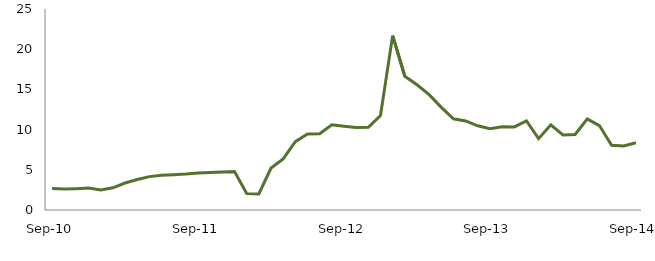
| Category | Series 0 |
|---|---|
| Sep-10 | 2.664 |
|  | 2.599 |
|  | 2.657 |
|  | 2.723 |
|  | 2.482 |
|  | 2.759 |
|  | 3.354 |
|  | 3.786 |
|  | 4.151 |
|  | 4.328 |
|  | 4.398 |
|  | 4.464 |
| Sep-11 | 4.588 |
|  | 4.679 |
|  | 4.725 |
|  | 4.771 |
|  | 2.048 |
|  | 1.991 |
|  | 5.225 |
|  | 6.354 |
|  | 8.497 |
|  | 9.463 |
|  | 9.491 |
|  | 10.603 |
| Sep-12 | 10.425 |
|  | 10.27 |
|  | 10.29 |
|  | 11.75 |
|  | 21.688 |
|  | 16.642 |
|  | 15.583 |
|  | 14.352 |
|  | 12.766 |
|  | 11.347 |
|  | 11.081 |
|  | 10.473 |
| Sep-13 | 10.123 |
|  | 10.344 |
|  | 10.337 |
|  | 11.09 |
|  | 8.878 |
|  | 10.595 |
|  | 9.33 |
|  | 9.398 |
|  | 11.339 |
|  | 10.501 |
|  | 8.045 |
|  | 7.955 |
| Sep-14 | 8.359 |